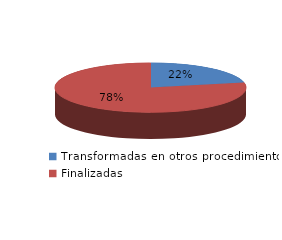
| Category | Series 0 |
|---|---|
| Transformadas en otros procedimientos | 1754 |
| Finalizadas | 6353 |